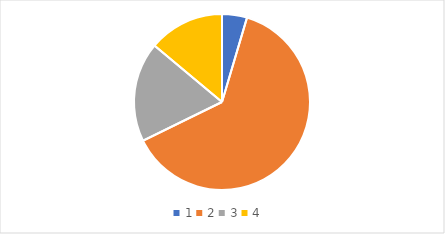
| Category | Series 0 |
|---|---|
| 0 | 27 |
| 1 | 372 |
| 2 | 108 |
| 3 | 82 |